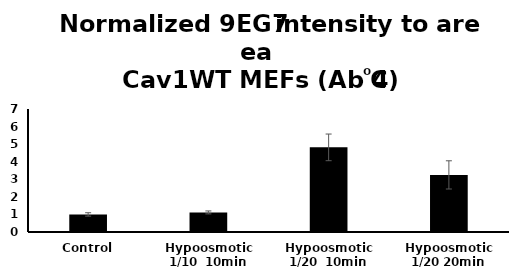
| Category | Cav1WT |
|---|---|
| Control | 1 |
| Hypoosmotic 1/10  10min | 1.114 |
| Hypoosmotic 1/20  10min | 4.817 |
| Hypoosmotic 1/20 20min | 3.25 |